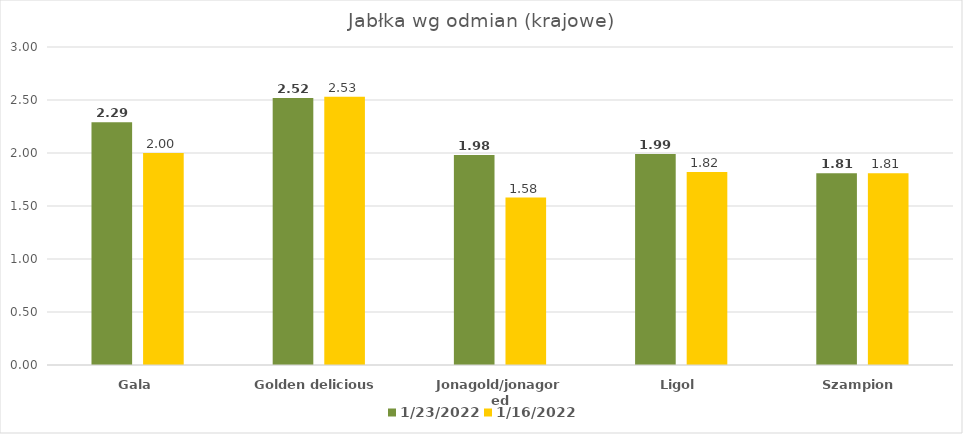
| Category | 2022-01-23 | 2022-01-16 |
|---|---|---|
| Gala | 2.29 | 2 |
| Golden delicious | 2.52 | 2.53 |
| Jonagold/jonagored | 1.98 | 1.58 |
| Ligol | 1.99 | 1.82 |
| Szampion | 1.81 | 1.81 |